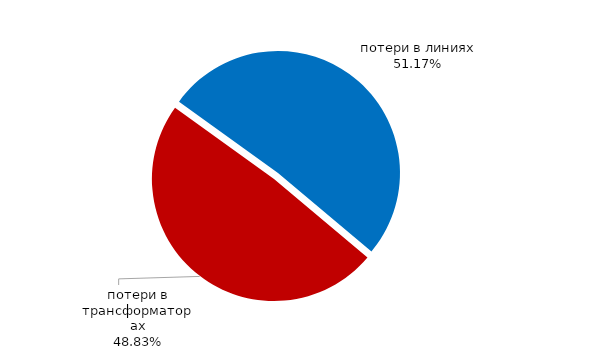
| Category | Series 0 |
|---|---|
| потери в трансформаторах | 34612.234 |
| потери в линиях | 36272.751 |